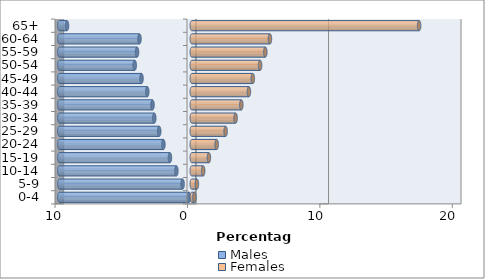
| Category | Males | Females |
|---|---|---|
| 0-4 | -0.208 | 0.195 |
| 5-9 | -0.692 | 0.387 |
| 10-14 | -1.163 | 0.861 |
| 15-19 | -1.648 | 1.293 |
| 20-24 | -2.142 | 1.879 |
| 25-29 | -2.46 | 2.556 |
| 30-34 | -2.834 | 3.309 |
| 35-39 | -2.967 | 3.74 |
| 40-44 | -3.36 | 4.313 |
| 45-49 | -3.796 | 4.609 |
| 50-54 | -4.308 | 5.16 |
| 55-59 | -4.133 | 5.553 |
| 60-64 | -3.95 | 5.901 |
| 65+ | -9.419 | 17.166 |